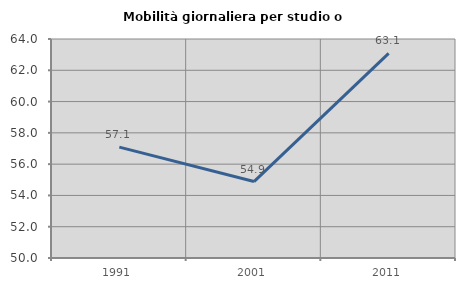
| Category | Mobilità giornaliera per studio o lavoro |
|---|---|
| 1991.0 | 57.088 |
| 2001.0 | 54.886 |
| 2011.0 | 63.081 |